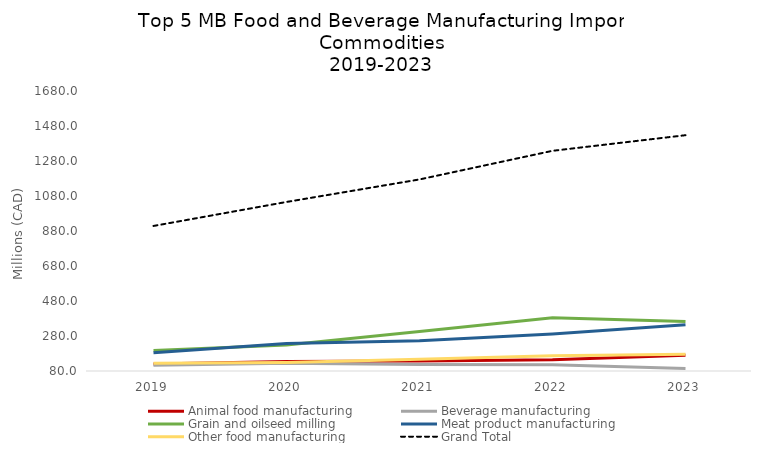
| Category | Animal food manufacturing | Beverage manufacturing | Grain and oilseed milling | Meat product manufacturing | Other food manufacturing | Grand Total |
|---|---|---|---|---|---|---|
| 2019.0 | 120.289 | 112.448 | 196.534 | 184.201 | 124.186 | 908.854 |
| 2020.0 | 134.353 | 124.309 | 228.483 | 237.786 | 128.414 | 1045.951 |
| 2021.0 | 137.405 | 117.39 | 306.277 | 252.386 | 147.016 | 1174.634 |
| 2022.0 | 144.286 | 115.756 | 384.66 | 292.044 | 167.821 | 1338.157 |
| 2023.0 | 170.001 | 93.673 | 363.533 | 344.702 | 176.33 | 1427.433 |